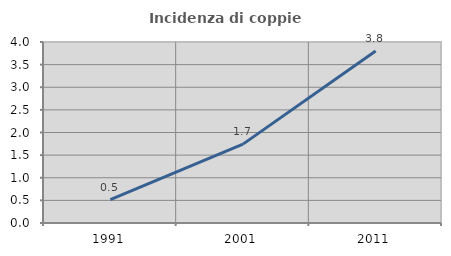
| Category | Incidenza di coppie miste |
|---|---|
| 1991.0 | 0.517 |
| 2001.0 | 1.743 |
| 2011.0 | 3.802 |